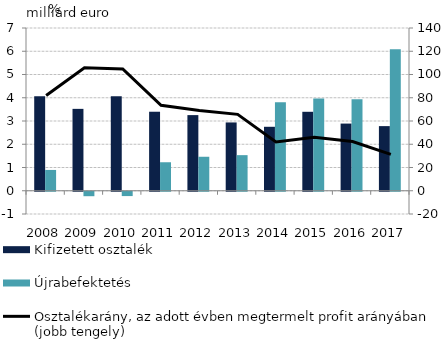
| Category | Kifizetett osztalék | Újrabefektetés |
|---|---|---|
| 2008.0 | 4.064 | 0.895 |
| 2009.0 | 3.522 | -0.192 |
| 2010.0 | 4.061 | -0.186 |
| 2011.0 | 3.399 | 1.226 |
| 2012.0 | 3.253 | 1.462 |
| 2013.0 | 2.938 | 1.531 |
| 2014.0 | 2.751 | 3.802 |
| 2015.0 | 3.396 | 3.968 |
| 2016.0 | 2.889 | 3.935 |
| 2017.0 | 2.78 | 6.09 |